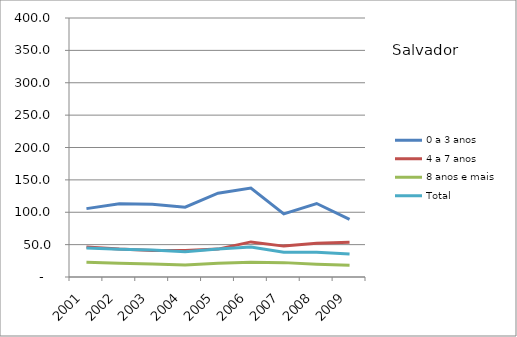
| Category | 0 a 3 anos | 4 a 7 anos | 8 anos e mais | Total |
|---|---|---|---|---|
| 2001.0 | 105.6 | 46.3 | 22.9 | 44.6 |
| 2002.0 | 113.1 | 43.1 | 21.1 | 43 |
| 2003.0 | 112.3 | 41.1 | 20.1 | 41.8 |
| 2004.0 | 107.9 | 41 | 18.7 | 39.1 |
| 2005.0 | 129.4 | 43.1 | 21.3 | 43.2 |
| 2006.0 | 137.5 | 54.2 | 22.6 | 46.2 |
| 2007.0 | 97.5 | 47.7 | 22.2 | 38.2 |
| 2008.0 | 113.5 | 52 | 19.6 | 38.2 |
| 2009.0 | 88.9 | 53.5 | 18.1 | 35.4 |